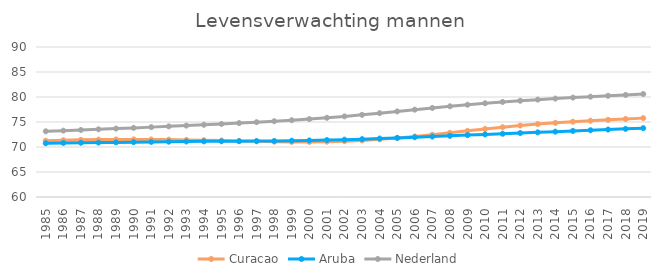
| Category | Curacao | Aruba | Nederland |
|---|---|---|---|
| 1985.0 | 71.256 | 70.757 | 73.14 |
| 1986.0 | 71.355 | 70.814 | 73.271 |
| 1987.0 | 71.428 | 70.851 | 73.402 |
| 1988.0 | 71.479 | 70.886 | 73.538 |
| 1989.0 | 71.51 | 70.924 | 73.678 |
| 1990.0 | 71.522 | 70.969 | 73.824 |
| 1991.0 | 71.511 | 71.018 | 73.975 |
| 1992.0 | 71.477 | 71.062 | 74.128 |
| 1993.0 | 71.424 | 71.098 | 74.285 |
| 1994.0 | 71.358 | 71.126 | 74.446 |
| 1995.0 | 71.283 | 71.148 | 74.611 |
| 1996.0 | 71.204 | 71.168 | 74.783 |
| 1997.0 | 71.126 | 71.19 | 74.963 |
| 1998.0 | 71.062 | 71.219 | 75.154 |
| 1999.0 | 71.02 | 71.259 | 75.359 |
| 2000.0 | 71.016 | 71.312 | 75.585 |
| 2001.0 | 71.062 | 71.382 | 75.84 |
| 2002.0 | 71.162 | 71.469 | 76.123 |
| 2003.0 | 71.317 | 71.572 | 76.433 |
| 2004.0 | 71.527 | 71.688 | 76.765 |
| 2005.0 | 71.791 | 71.816 | 77.111 |
| 2006.0 | 72.107 | 71.952 | 77.464 |
| 2007.0 | 72.462 | 72.093 | 77.811 |
| 2008.0 | 72.84 | 72.235 | 78.144 |
| 2009.0 | 73.227 | 72.377 | 78.457 |
| 2010.0 | 73.607 | 72.517 | 78.745 |
| 2011.0 | 73.963 | 72.654 | 79.007 |
| 2012.0 | 74.29 | 72.792 | 79.248 |
| 2013.0 | 74.583 | 72.93 | 79.472 |
| 2014.0 | 74.838 | 73.069 | 79.681 |
| 2015.0 | 75.058 | 73.208 | 79.877 |
| 2016.0 | 75.251 | 73.348 | 80.064 |
| 2017.0 | 75.428 | 73.488 | 80.244 |
| 2018.0 | 75.601 | 73.628 | 80.419 |
| 2019.0 | 75.775 | 73.768 | 80.592 |